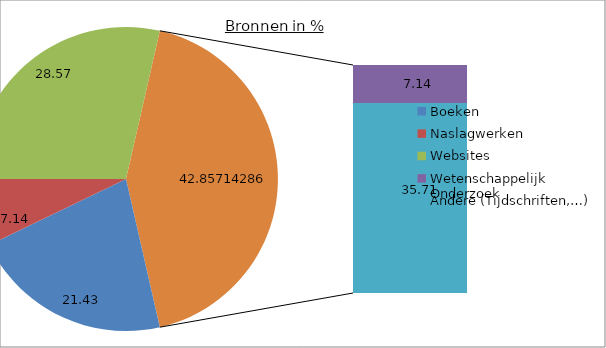
| Category | Series 0 |
|---|---|
| Boeken | 21.429 |
| Naslagwerken | 7.143 |
| Websites | 28.571 |
| Wetenschappelijk Onderzoek | 7.143 |
| Andere (Tijdschriften,…) | 35.714 |